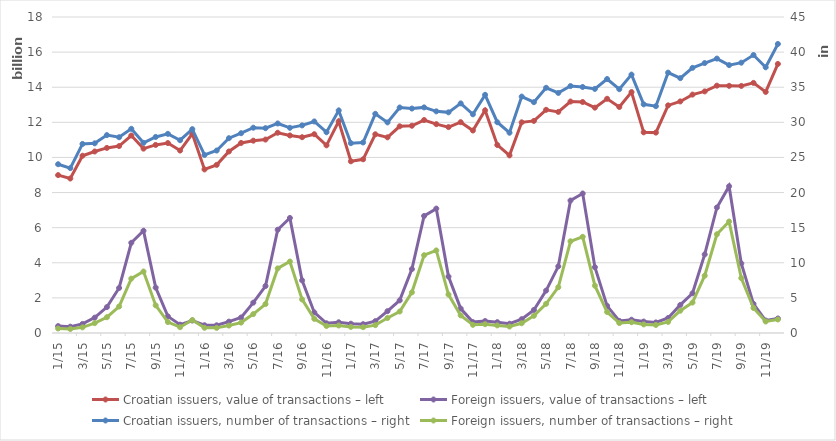
| Category | Croatian issuers, value of transactions – left | Foreign issuers, value of transactions – left |
|---|---|---|
| 2015-01-01 | 8994025271 | 392887043 |
| 2015-02-01 | 8800036174 | 360578001 |
| 2015-03-01 | 10097058766 | 515915901 |
| 2015-04-01 | 10338785985 | 875908455 |
| 2015-05-01 | 10542688074 | 1476075593 |
| 2015-06-01 | 10649312994 | 2564850254 |
| 2015-07-01 | 11248842312 | 5138493752 |
| 2015-08-01 | 10502147963 | 5824208164 |
| 2015-09-01 | 10713265770 | 2584419239 |
| 2015-10-01 | 10819164689 | 946749241 |
| 2015-11-01 | 10393388690 | 473256061 |
| 2015-12-01 | 11345706350 | 710466353 |
| 2016-01-01 | 9317746815 | 441856028 |
| 2016-02-01 | 9576821038 | 438769379 |
| 2016-03-01 | 10339326725 | 647339028 |
| 2016-04-01 | 10825809318 | 884583155 |
| 2016-05-01 | 10955398175 | 1729494397 |
| 2016-06-01 | 11018977541 | 2676151777 |
| 2016-07-01 | 11407397299 | 5882317756 |
| 2016-08-01 | 11252543958 | 6552115285 |
| 2016-09-01 | 11152267687 | 3000126625 |
| 2016-10-01 | 11323295107 | 1172353982 |
| 2016-11-01 | 10690015167 | 552867564 |
| 2016-12-01 | 12058984612 | 610678340 |
| 2017-01-01 | 9781216393 | 529330668 |
| 2017-02-01 | 9895011020 | 503480826 |
| 2017-03-01 | 11319301571 | 675467602 |
| 2017-04-01 | 11145176506 | 1243470970 |
| 2017-05-01 | 11773923776 | 1858098682 |
| 2017-06-01 | 11805960086 | 3640275087 |
| 2017-07-01 | 12131026231 | 6666766323 |
| 2017-08-01 | 11896320391 | 7086538105 |
| 2017-09-01 | 11728853022 | 3215744763 |
| 2017-10-01 | 12009171220 | 1390350453 |
| 2017-11-01 | 11534666862 | 620958222 |
| 2017-12-01 | 12684067350 | 681553609 |
| 2018-01-01 | 10710750209 | 618464165 |
| 2018-02-01 | 10117059082 | 528007961 |
| 2018-03-01 | 12000973469 | 787148459 |
| 2018-04-01 | 12081590304 | 1313997401 |
| 2018-05-01 | 12713590892 | 2414981001 |
| 2018-06-01 | 12594666713 | 3797479716 |
| 2018-07-01 | 13184944027 | 7546528379 |
| 2018-08-01 | 13157775732 | 7945964838 |
| 2018-09-01 | 12835500264 | 3750047605 |
| 2018-10-01 | 13341672667 | 1546133091 |
| 2018-11-01 | 12874089328 | 688682409 |
| 2018-12-01 | 13720361438 | 756236735 |
| 2019-01-01 | 11430733666 | 652102734 |
| 2019-02-01 | 11414401297 | 602100076 |
| 2019-03-01 | 12966421931 | 853196400 |
| 2019-04-01 | 13190429881 | 1599239317 |
| 2019-05-01 | 13580364900 | 2261956817 |
| 2019-06-01 | 13761363081 | 4476990759 |
| 2019-07-01 | 14088269414 | 7149142603 |
| 2019-08-01 | 14078608908 | 8359730082 |
| 2019-09-01 | 14072427523 | 3961960473 |
| 2019-10-01 | 14247219239 | 1659254244 |
| 2019-11-01 | 13732018595 | 710916631 |
| 2019-12-01 | 15325515357 | 828086145 |